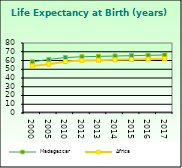
| Category | Madagascar | Africa                        |
|---|---|---|
| 2000.0 | 58.485 | 53.721 |
| 2005.0 | 61.212 | 55.757 |
| 2010.0 | 63.392 | 58.857 |
| 2012.0 | 64.278 | 59.91 |
| 2013.0 | 64.706 | 60.376 |
| 2014.0 | 65.118 | 60.801 |
| 2015.0 | 65.515 | 61.187 |
| 2016.0 | 65.898 | 61.538 |
| 2017.0 | 66.268 | 61.865 |